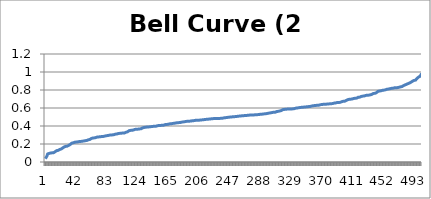
| Category | Bell Curve (2 dice) |
|---|---|
| 0 | 0.037 |
| 1 | 0.051 |
| 2 | 0.064 |
| 3 | 0.089 |
| 4 | 0.091 |
| 5 | 0.096 |
| 6 | 0.1 |
| 7 | 0.1 |
| 8 | 0.1 |
| 9 | 0.102 |
| 10 | 0.104 |
| 11 | 0.104 |
| 12 | 0.114 |
| 13 | 0.115 |
| 14 | 0.12 |
| 15 | 0.126 |
| 16 | 0.127 |
| 17 | 0.13 |
| 18 | 0.138 |
| 19 | 0.14 |
| 20 | 0.141 |
| 21 | 0.144 |
| 22 | 0.153 |
| 23 | 0.156 |
| 24 | 0.167 |
| 25 | 0.167 |
| 26 | 0.17 |
| 27 | 0.174 |
| 28 | 0.175 |
| 29 | 0.176 |
| 30 | 0.18 |
| 31 | 0.185 |
| 32 | 0.195 |
| 33 | 0.195 |
| 34 | 0.199 |
| 35 | 0.21 |
| 36 | 0.21 |
| 37 | 0.213 |
| 38 | 0.22 |
| 39 | 0.22 |
| 40 | 0.22 |
| 41 | 0.222 |
| 42 | 0.224 |
| 43 | 0.224 |
| 44 | 0.226 |
| 45 | 0.227 |
| 46 | 0.228 |
| 47 | 0.229 |
| 48 | 0.229 |
| 49 | 0.231 |
| 50 | 0.233 |
| 51 | 0.234 |
| 52 | 0.234 |
| 53 | 0.237 |
| 54 | 0.237 |
| 55 | 0.239 |
| 56 | 0.242 |
| 57 | 0.247 |
| 58 | 0.248 |
| 59 | 0.25 |
| 60 | 0.251 |
| 61 | 0.261 |
| 62 | 0.267 |
| 63 | 0.267 |
| 64 | 0.267 |
| 65 | 0.268 |
| 66 | 0.27 |
| 67 | 0.272 |
| 68 | 0.277 |
| 69 | 0.278 |
| 70 | 0.278 |
| 71 | 0.279 |
| 72 | 0.279 |
| 73 | 0.28 |
| 74 | 0.281 |
| 75 | 0.284 |
| 76 | 0.284 |
| 77 | 0.284 |
| 78 | 0.288 |
| 79 | 0.288 |
| 80 | 0.29 |
| 81 | 0.292 |
| 82 | 0.294 |
| 83 | 0.294 |
| 84 | 0.298 |
| 85 | 0.298 |
| 86 | 0.3 |
| 87 | 0.3 |
| 88 | 0.301 |
| 89 | 0.302 |
| 90 | 0.302 |
| 91 | 0.304 |
| 92 | 0.304 |
| 93 | 0.309 |
| 94 | 0.312 |
| 95 | 0.312 |
| 96 | 0.315 |
| 97 | 0.317 |
| 98 | 0.318 |
| 99 | 0.319 |
| 100 | 0.319 |
| 101 | 0.321 |
| 102 | 0.321 |
| 103 | 0.322 |
| 104 | 0.322 |
| 105 | 0.323 |
| 106 | 0.329 |
| 107 | 0.331 |
| 108 | 0.332 |
| 109 | 0.336 |
| 110 | 0.343 |
| 111 | 0.348 |
| 112 | 0.351 |
| 113 | 0.351 |
| 114 | 0.352 |
| 115 | 0.352 |
| 116 | 0.355 |
| 117 | 0.357 |
| 118 | 0.358 |
| 119 | 0.363 |
| 120 | 0.363 |
| 121 | 0.364 |
| 122 | 0.364 |
| 123 | 0.365 |
| 124 | 0.366 |
| 125 | 0.368 |
| 126 | 0.368 |
| 127 | 0.37 |
| 128 | 0.375 |
| 129 | 0.379 |
| 130 | 0.382 |
| 131 | 0.384 |
| 132 | 0.386 |
| 133 | 0.386 |
| 134 | 0.388 |
| 135 | 0.389 |
| 136 | 0.389 |
| 137 | 0.389 |
| 138 | 0.39 |
| 139 | 0.392 |
| 140 | 0.392 |
| 141 | 0.394 |
| 142 | 0.394 |
| 143 | 0.396 |
| 144 | 0.397 |
| 145 | 0.397 |
| 146 | 0.398 |
| 147 | 0.398 |
| 148 | 0.401 |
| 149 | 0.403 |
| 150 | 0.405 |
| 151 | 0.406 |
| 152 | 0.406 |
| 153 | 0.407 |
| 154 | 0.407 |
| 155 | 0.408 |
| 156 | 0.409 |
| 157 | 0.41 |
| 158 | 0.41 |
| 159 | 0.416 |
| 160 | 0.416 |
| 161 | 0.417 |
| 162 | 0.418 |
| 163 | 0.42 |
| 164 | 0.421 |
| 165 | 0.424 |
| 166 | 0.425 |
| 167 | 0.425 |
| 168 | 0.426 |
| 169 | 0.429 |
| 170 | 0.429 |
| 171 | 0.43 |
| 172 | 0.43 |
| 173 | 0.434 |
| 174 | 0.435 |
| 175 | 0.435 |
| 176 | 0.436 |
| 177 | 0.438 |
| 178 | 0.439 |
| 179 | 0.439 |
| 180 | 0.442 |
| 181 | 0.443 |
| 182 | 0.446 |
| 183 | 0.446 |
| 184 | 0.446 |
| 185 | 0.448 |
| 186 | 0.449 |
| 187 | 0.451 |
| 188 | 0.452 |
| 189 | 0.453 |
| 190 | 0.453 |
| 191 | 0.454 |
| 192 | 0.454 |
| 193 | 0.454 |
| 194 | 0.459 |
| 195 | 0.459 |
| 196 | 0.459 |
| 197 | 0.46 |
| 198 | 0.461 |
| 199 | 0.463 |
| 200 | 0.463 |
| 201 | 0.463 |
| 202 | 0.464 |
| 203 | 0.464 |
| 204 | 0.466 |
| 205 | 0.466 |
| 206 | 0.466 |
| 207 | 0.467 |
| 208 | 0.469 |
| 209 | 0.469 |
| 210 | 0.469 |
| 211 | 0.471 |
| 212 | 0.472 |
| 213 | 0.474 |
| 214 | 0.475 |
| 215 | 0.475 |
| 216 | 0.476 |
| 217 | 0.477 |
| 218 | 0.478 |
| 219 | 0.478 |
| 220 | 0.48 |
| 221 | 0.481 |
| 222 | 0.482 |
| 223 | 0.482 |
| 224 | 0.482 |
| 225 | 0.482 |
| 226 | 0.484 |
| 227 | 0.484 |
| 228 | 0.484 |
| 229 | 0.484 |
| 230 | 0.484 |
| 231 | 0.484 |
| 232 | 0.485 |
| 233 | 0.485 |
| 234 | 0.485 |
| 235 | 0.487 |
| 236 | 0.487 |
| 237 | 0.49 |
| 238 | 0.491 |
| 239 | 0.492 |
| 240 | 0.494 |
| 241 | 0.495 |
| 242 | 0.495 |
| 243 | 0.497 |
| 244 | 0.499 |
| 245 | 0.499 |
| 246 | 0.5 |
| 247 | 0.501 |
| 248 | 0.502 |
| 249 | 0.503 |
| 250 | 0.503 |
| 251 | 0.504 |
| 252 | 0.504 |
| 253 | 0.505 |
| 254 | 0.507 |
| 255 | 0.508 |
| 256 | 0.51 |
| 257 | 0.51 |
| 258 | 0.51 |
| 259 | 0.51 |
| 260 | 0.513 |
| 261 | 0.514 |
| 262 | 0.514 |
| 263 | 0.515 |
| 264 | 0.517 |
| 265 | 0.517 |
| 266 | 0.517 |
| 267 | 0.518 |
| 268 | 0.518 |
| 269 | 0.518 |
| 270 | 0.52 |
| 271 | 0.522 |
| 272 | 0.522 |
| 273 | 0.522 |
| 274 | 0.522 |
| 275 | 0.523 |
| 276 | 0.523 |
| 277 | 0.524 |
| 278 | 0.524 |
| 279 | 0.524 |
| 280 | 0.525 |
| 281 | 0.526 |
| 282 | 0.526 |
| 283 | 0.527 |
| 284 | 0.527 |
| 285 | 0.53 |
| 286 | 0.531 |
| 287 | 0.531 |
| 288 | 0.532 |
| 289 | 0.533 |
| 290 | 0.535 |
| 291 | 0.535 |
| 292 | 0.536 |
| 293 | 0.537 |
| 294 | 0.54 |
| 295 | 0.541 |
| 296 | 0.543 |
| 297 | 0.544 |
| 298 | 0.545 |
| 299 | 0.547 |
| 300 | 0.547 |
| 301 | 0.551 |
| 302 | 0.553 |
| 303 | 0.553 |
| 304 | 0.553 |
| 305 | 0.554 |
| 306 | 0.554 |
| 307 | 0.561 |
| 308 | 0.562 |
| 309 | 0.564 |
| 310 | 0.566 |
| 311 | 0.567 |
| 312 | 0.571 |
| 313 | 0.572 |
| 314 | 0.581 |
| 315 | 0.582 |
| 316 | 0.582 |
| 317 | 0.584 |
| 318 | 0.586 |
| 319 | 0.587 |
| 320 | 0.587 |
| 321 | 0.588 |
| 322 | 0.588 |
| 323 | 0.588 |
| 324 | 0.589 |
| 325 | 0.59 |
| 326 | 0.59 |
| 327 | 0.59 |
| 328 | 0.59 |
| 329 | 0.591 |
| 330 | 0.595 |
| 331 | 0.595 |
| 332 | 0.595 |
| 333 | 0.6 |
| 334 | 0.601 |
| 335 | 0.601 |
| 336 | 0.603 |
| 337 | 0.604 |
| 338 | 0.605 |
| 339 | 0.607 |
| 340 | 0.607 |
| 341 | 0.608 |
| 342 | 0.61 |
| 343 | 0.61 |
| 344 | 0.611 |
| 345 | 0.612 |
| 346 | 0.612 |
| 347 | 0.614 |
| 348 | 0.614 |
| 349 | 0.615 |
| 350 | 0.616 |
| 351 | 0.617 |
| 352 | 0.621 |
| 353 | 0.621 |
| 354 | 0.621 |
| 355 | 0.625 |
| 356 | 0.626 |
| 357 | 0.627 |
| 358 | 0.628 |
| 359 | 0.629 |
| 360 | 0.63 |
| 361 | 0.631 |
| 362 | 0.631 |
| 363 | 0.632 |
| 364 | 0.633 |
| 365 | 0.637 |
| 366 | 0.638 |
| 367 | 0.638 |
| 368 | 0.638 |
| 369 | 0.642 |
| 370 | 0.643 |
| 371 | 0.643 |
| 372 | 0.643 |
| 373 | 0.643 |
| 374 | 0.643 |
| 375 | 0.645 |
| 376 | 0.646 |
| 377 | 0.646 |
| 378 | 0.647 |
| 379 | 0.648 |
| 380 | 0.648 |
| 381 | 0.649 |
| 382 | 0.651 |
| 383 | 0.654 |
| 384 | 0.655 |
| 385 | 0.656 |
| 386 | 0.66 |
| 387 | 0.661 |
| 388 | 0.662 |
| 389 | 0.662 |
| 390 | 0.662 |
| 391 | 0.663 |
| 392 | 0.667 |
| 393 | 0.67 |
| 394 | 0.673 |
| 395 | 0.675 |
| 396 | 0.675 |
| 397 | 0.676 |
| 398 | 0.679 |
| 399 | 0.683 |
| 400 | 0.687 |
| 401 | 0.693 |
| 402 | 0.694 |
| 403 | 0.696 |
| 404 | 0.698 |
| 405 | 0.698 |
| 406 | 0.7 |
| 407 | 0.7 |
| 408 | 0.703 |
| 409 | 0.706 |
| 410 | 0.707 |
| 411 | 0.708 |
| 412 | 0.709 |
| 413 | 0.71 |
| 414 | 0.717 |
| 415 | 0.72 |
| 416 | 0.721 |
| 417 | 0.721 |
| 418 | 0.723 |
| 419 | 0.728 |
| 420 | 0.73 |
| 421 | 0.732 |
| 422 | 0.733 |
| 423 | 0.734 |
| 424 | 0.74 |
| 425 | 0.74 |
| 426 | 0.741 |
| 427 | 0.743 |
| 428 | 0.743 |
| 429 | 0.743 |
| 430 | 0.745 |
| 431 | 0.747 |
| 432 | 0.748 |
| 433 | 0.752 |
| 434 | 0.758 |
| 435 | 0.762 |
| 436 | 0.762 |
| 437 | 0.763 |
| 438 | 0.764 |
| 439 | 0.77 |
| 440 | 0.771 |
| 441 | 0.785 |
| 442 | 0.786 |
| 443 | 0.788 |
| 444 | 0.79 |
| 445 | 0.791 |
| 446 | 0.792 |
| 447 | 0.797 |
| 448 | 0.797 |
| 449 | 0.799 |
| 450 | 0.799 |
| 451 | 0.802 |
| 452 | 0.804 |
| 453 | 0.809 |
| 454 | 0.81 |
| 455 | 0.811 |
| 456 | 0.811 |
| 457 | 0.814 |
| 458 | 0.817 |
| 459 | 0.818 |
| 460 | 0.818 |
| 461 | 0.82 |
| 462 | 0.821 |
| 463 | 0.824 |
| 464 | 0.826 |
| 465 | 0.826 |
| 466 | 0.826 |
| 467 | 0.826 |
| 468 | 0.829 |
| 469 | 0.83 |
| 470 | 0.832 |
| 471 | 0.835 |
| 472 | 0.837 |
| 473 | 0.838 |
| 474 | 0.847 |
| 475 | 0.849 |
| 476 | 0.852 |
| 477 | 0.856 |
| 478 | 0.862 |
| 479 | 0.863 |
| 480 | 0.868 |
| 481 | 0.871 |
| 482 | 0.873 |
| 483 | 0.878 |
| 484 | 0.878 |
| 485 | 0.887 |
| 486 | 0.888 |
| 487 | 0.898 |
| 488 | 0.898 |
| 489 | 0.906 |
| 490 | 0.907 |
| 491 | 0.91 |
| 492 | 0.913 |
| 493 | 0.929 |
| 494 | 0.936 |
| 495 | 0.944 |
| 496 | 0.948 |
| 497 | 0.953 |
| 498 | 0.968 |
| 499 | 0.983 |